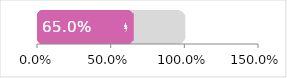
| Category | Total | Female |
|---|---|---|
| 0 | 1 | 0.65 |